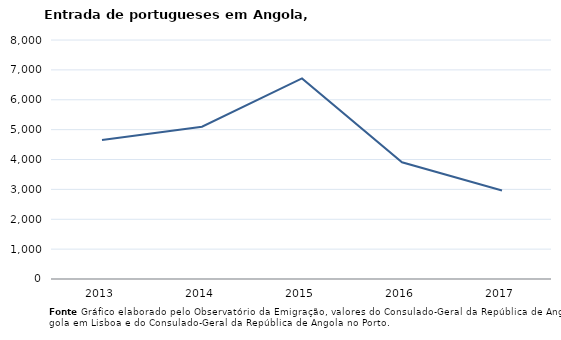
| Category | Entradas |
|---|---|
| 2013.0 | 4651 |
| 2014.0 | 5098 |
| 2015.0 | 6715 |
| 2016.0 | 3908 |
| 2017.0 | 2962 |